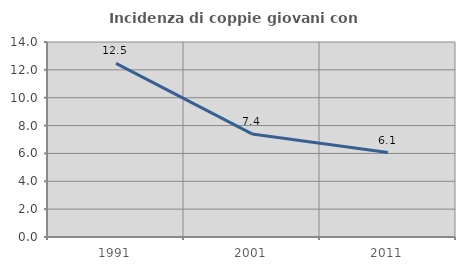
| Category | Incidenza di coppie giovani con figli |
|---|---|
| 1991.0 | 12.468 |
| 2001.0 | 7.401 |
| 2011.0 | 6.061 |